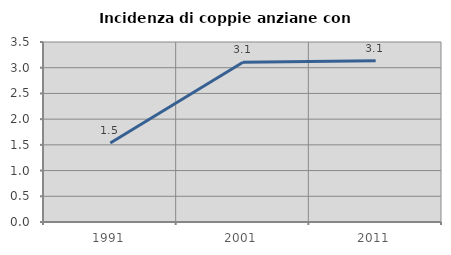
| Category | Incidenza di coppie anziane con figli |
|---|---|
| 1991.0 | 1.535 |
| 2001.0 | 3.106 |
| 2011.0 | 3.134 |